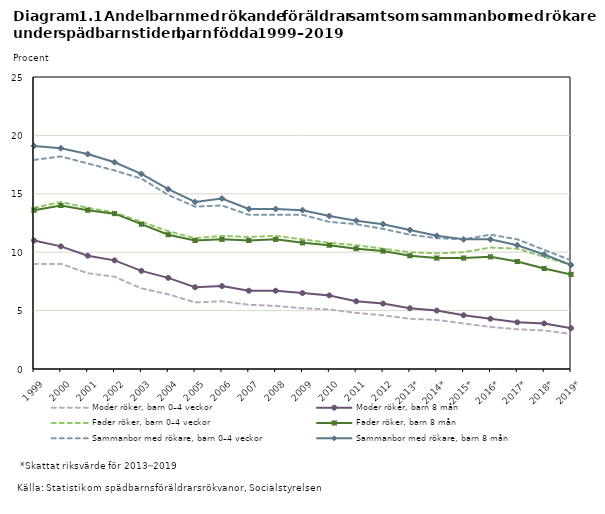
| Category | Moder röker, barn 0–4 veckor | Moder röker, barn 8 mån | Fader röker, barn 0–4 veckor  | Fader röker, barn 8 mån | Sammanbor med rökare, barn 0–4 veckor | Sammanbor med rökare, barn 8 mån |
|---|---|---|---|---|---|---|
| 1999 | 9 | 11 | 13.8 | 13.6 | 17.9 | 19.1 |
| 2000 | 9 | 10.5 | 14.3 | 14 | 18.2 | 18.9 |
| 2001 | 8.2 | 9.7 | 13.8 | 13.6 | 17.6 | 18.4 |
| 2002 | 7.9 | 9.3 | 13.4 | 13.3 | 17 | 17.7 |
| 2003 | 6.9 | 8.4 | 12.6 | 12.4 | 16.3 | 16.7 |
| 2004 | 6.4 | 7.8 | 11.8 | 11.5 | 14.9 | 15.4 |
| 2005 | 5.7 | 7 | 11.2 | 11 | 13.9 | 14.3 |
| 2006 | 5.8 | 7.1 | 11.4 | 11.1 | 14 | 14.6 |
| 2007 | 5.5 | 6.7 | 11.3 | 11 | 13.2 | 13.7 |
| 2008 | 5.4 | 6.7 | 11.4 | 11.1 | 13.2 | 13.7 |
| 2009 | 5.2 | 6.5 | 11.1 | 10.8 | 13.2 | 13.6 |
| 2010 | 5.1 | 6.3 | 10.8 | 10.6 | 12.6 | 13.1 |
| 2011 | 4.8 | 5.8 | 10.6 | 10.3 | 12.4 | 12.7 |
| 2012 | 4.6 | 5.6 | 10.3 | 10.1 | 12 | 12.4 |
| 2013* | 4.3 | 5.2 | 10 | 9.7 | 11.5 | 11.9 |
| 2014* | 4.2 | 5 | 9.9 | 9.5 | 11.2 | 11.4 |
| 2015* | 3.9 | 4.6 | 10 | 9.5 | 11.1 | 11.1 |
| 2016* | 3.6 | 4.3 | 10.4 | 9.6 | 11.5 | 11.1 |
| 2017* | 3.4 | 4 | 10.3 | 9.2 | 11.1 | 10.6 |
| 2018* | 3.3 | 3.9 | 9.6 | 8.6 | 10.2 | 9.8 |
| 2019* | 3 | 3.5 | 8.9 | 8.1 | 9.3 | 8.9 |